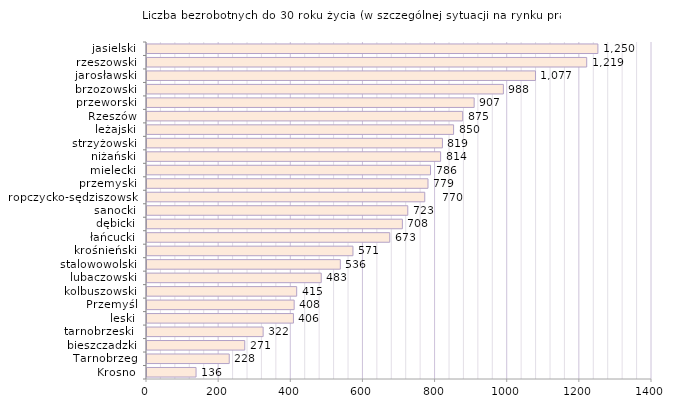
| Category | Liczba bezrobotnych do 30 roku życia - w szczególnej sytuacji na rynku pracy |
|---|---|
| Krosno | 136 |
| Tarnobrzeg | 228 |
| bieszczadzki | 271 |
| tarnobrzeski  | 322 |
| leski | 406 |
| Przemyśl | 408 |
| kolbuszowski | 415 |
| lubaczowski | 483 |
| stalowowolski | 536 |
| krośnieński | 571 |
| łańcucki | 673 |
| dębicki | 708 |
| sanocki | 723 |
| ropczycko-sędziszowski | 770 |
| przemyski | 779 |
| mielecki | 786 |
| niżański | 814 |
| strzyżowski | 819 |
| leżajski | 850 |
| Rzeszów | 875 |
| przeworski | 907 |
| brzozowski | 988 |
| jarosławski | 1077 |
| rzeszowski | 1219 |
| jasielski | 1250 |